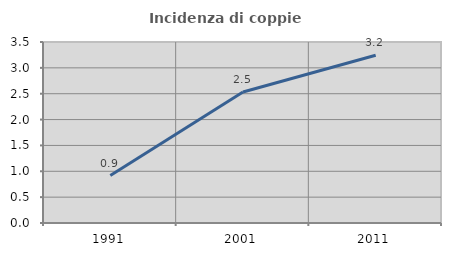
| Category | Incidenza di coppie miste |
|---|---|
| 1991.0 | 0.917 |
| 2001.0 | 2.533 |
| 2011.0 | 3.244 |